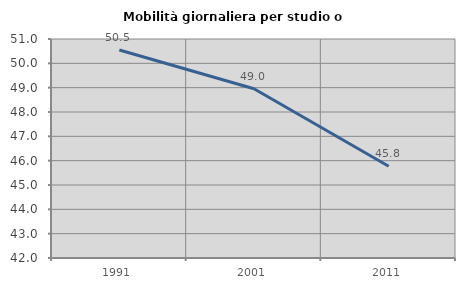
| Category | Mobilità giornaliera per studio o lavoro |
|---|---|
| 1991.0 | 50.549 |
| 2001.0 | 48.955 |
| 2011.0 | 45.773 |